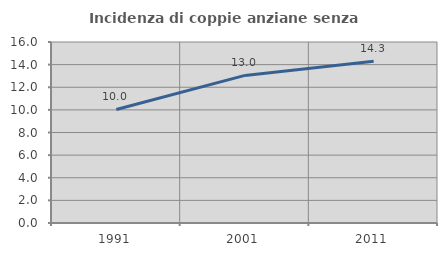
| Category | Incidenza di coppie anziane senza figli  |
|---|---|
| 1991.0 | 10.038 |
| 2001.0 | 13.047 |
| 2011.0 | 14.306 |